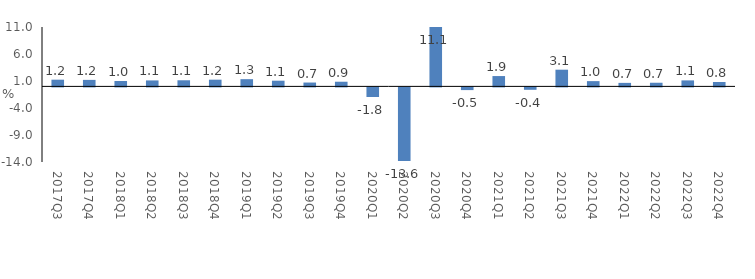
| Category | Series 0 |
|---|---|
| 2017Q3 | 1.245 |
| 2017Q4 | 1.207 |
| 2018Q1 | 1.001 |
| 2018Q2 | 1.107 |
| 2018Q3 | 1.135 |
| 2018Q4 | 1.244 |
| 2019Q1 | 1.34 |
| 2019Q2 | 1.057 |
| 2019Q3 | 0.715 |
| 2019Q4 | 0.865 |
| 2020Q1 | -1.777 |
| 2020Q2 | -13.642 |
| 2020Q3 | 11.057 |
| 2020Q4 | -0.499 |
| 2021Q1 | 1.916 |
| 2021Q2 | -0.445 |
| 2021Q3 | 3.095 |
| 2021Q4 | 0.978 |
| 2022Q1 | 0.653 |
| 2022Q2 | 0.677 |
| 2022Q3 | 1.113 |
| 2022Q4 | 0.821 |